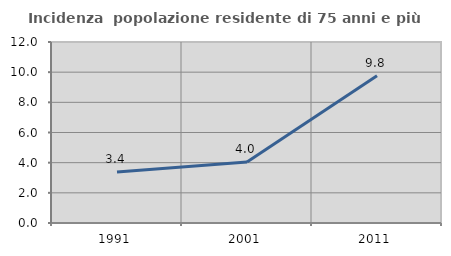
| Category | Incidenza  popolazione residente di 75 anni e più |
|---|---|
| 1991.0 | 3.385 |
| 2001.0 | 4.049 |
| 2011.0 | 9.763 |